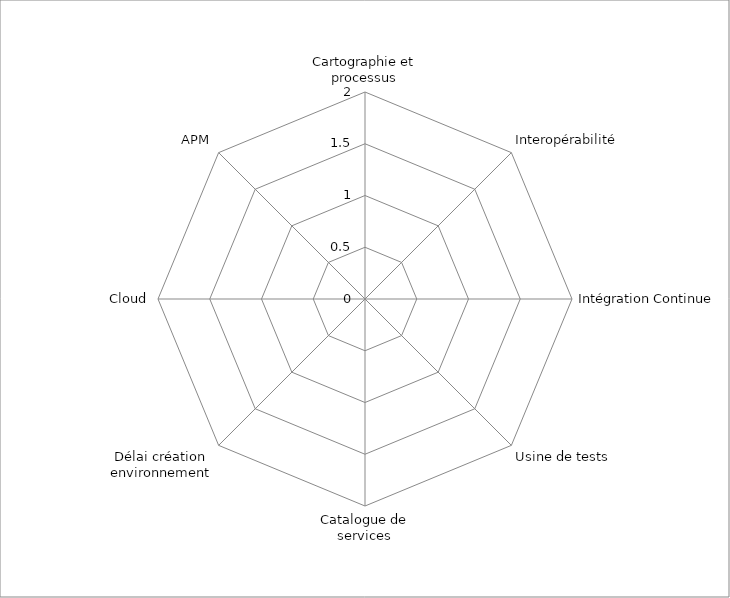
| Category | Series 0 |
|---|---|
| Cartographie et processus | 0 |
| Interopérabilité | 0 |
| Intégration Continue | 0 |
| Usine de tests | 0 |
| Catalogue de services | 0 |
| Délai création environnement | 0 |
| Cloud | 0 |
| APM | 0 |